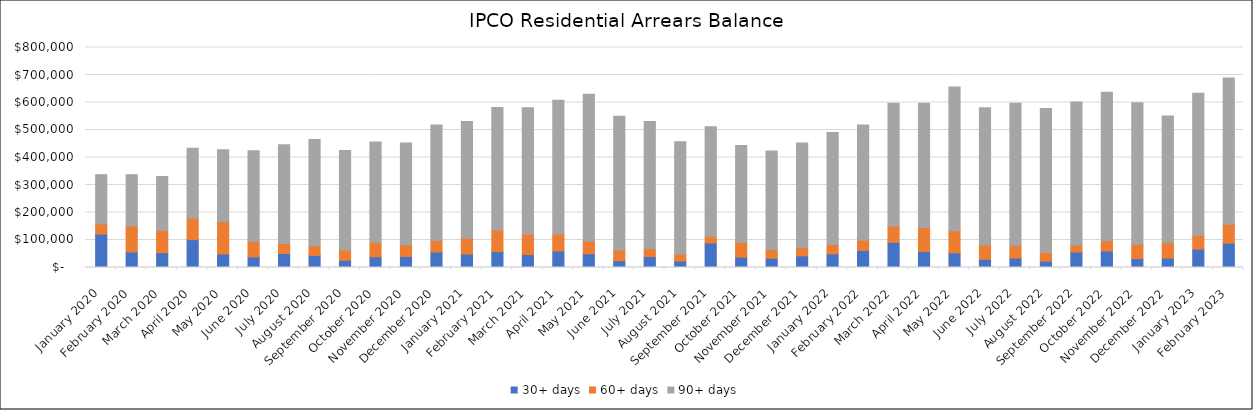
| Category | 30+ days | 60+ days | 90+ days |
|---|---|---|---|
| 2020-01-01 | 121205.02 | 37406.79 | 178950.92 |
| 2020-02-01 | 56386.25 | 95092.75 | 186049.44 |
| 2020-03-01 | 53917.49 | 80652.64 | 196306.52 |
| 2020-04-01 | 101100.63 | 78348.39 | 253872.71 |
| 2020-05-01 | 48963.29 | 117915.78 | 261033.4 |
| 2020-06-01 | 38720.67 | 55512.05 | 330118.1 |
| 2020-07-01 | 50988.84 | 36396.35 | 358988.03 |
| 2020-08-01 | 43903 | 34740.43 | 386742.64 |
| 2020-09-01 | 26392.57 | 37624.46 | 361606.19 |
| 2020-10-01 | 38955.22 | 51992.87 | 365151.13 |
| 2020-11-01 | 40331.97 | 42239.14 | 369786.31 |
| 2020-12-01 | 56048.92 | 41793.41 | 420076.33 |
| 2021-01-01 | 49041 | 57218 | 424636 |
| 2021-02-01 | 57540.28 | 77568.16 | 446504.66 |
| 2021-03-01 | 46812.46 | 74210.57 | 460275.82 |
| 2021-04-01 | 59640.94 | 61854.18 | 486337.07 |
| 2021-05-01 | 49883.79 | 46468.51 | 533613.05 |
| 2021-06-01 | 24764.5 | 38646.89 | 486633.11 |
| 2021-07-01 | 39784.05 | 27994.56 | 462895.84 |
| 2021-08-01 | 23321.85 | 24845.46 | 409082.61 |
| 2021-09-01 | 89196.45 | 24157.14 | 398282.24 |
| 2021-10-01 | 37647.86 | 53468.92 | 352281.17 |
| 2021-11-01 | 33507.62 | 30992.88 | 359110.63 |
| 2021-12-01 | 42308.39 | 29623.86 | 380701.07 |
| 2022-01-01 | 49509.26 | 33727.76 | 407982.79 |
| 2022-02-01 | 62136.32 | 37308.64 | 418316.53 |
| 2022-03-01 | 91317.11 | 59146.36 | 447263.58 |
| 2022-04-01 | 57828.01 | 87577.46 | 452062.54 |
| 2022-05-01 | 53362.16 | 80239.65 | 522884.2 |
| 2022-06-01 | 29863.78 | 52085.21 | 499283.39 |
| 2022-07-01 | 34312.71 | 45440.82 | 517843.96 |
| 2022-08-01 | 22880.03 | 32085.81 | 522948.54 |
| 2022-09-01 | 56357.71 | 25085.57 | 520191.6 |
| 2022-10-01 | 60295.37 | 36662.11 | 540432.08 |
| 2022-11-01 | 32551 | 52195.18 | 514793.97 |
| 2022-12-01 | 34343.77 | 55275.02 | 461687.28 |
| 2023-01-01 | 66787.99 | 50830.75 | 516180.86 |
| 2023-02-01 | 88480.6 | 68517.64 | 531925.68 |